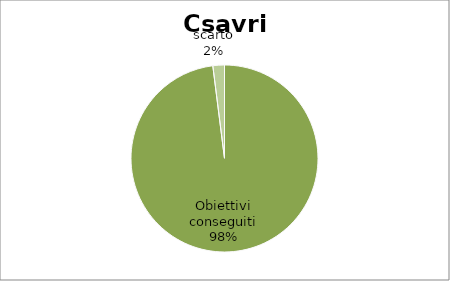
| Category | Series 0 |
|---|---|
| Obiettivi conseguiti | 98 |
| scarto | 2 |